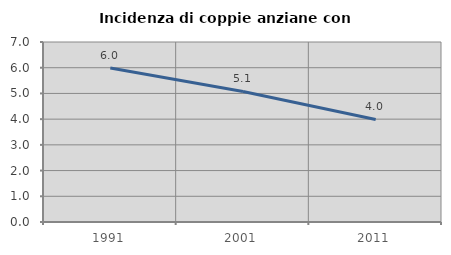
| Category | Incidenza di coppie anziane con figli |
|---|---|
| 1991.0 | 5.985 |
| 2001.0 | 5.076 |
| 2011.0 | 3.989 |